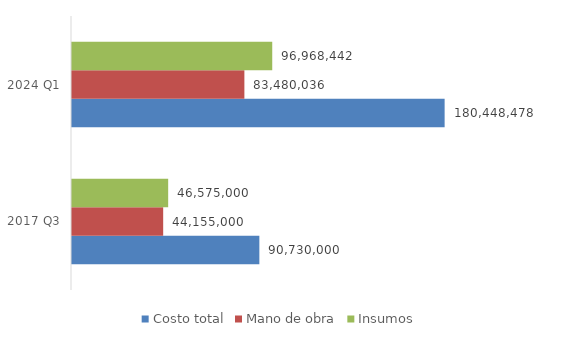
| Category | Costo total | Mano de obra | Insumos |
|---|---|---|---|
| 2017 Q3 | 90730000 | 44155000 | 46575000 |
| 2024 Q1 | 180448478.348 | 83480036 | 96968442.348 |